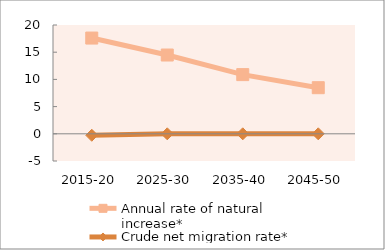
| Category | Annual rate of natural increase* | Crude net migration rate* |
|---|---|---|
| 2015-20 | 17.6 | -0.267 |
| 2025-30 | 14.48 | 0 |
| 2035-40 | 10.879 | 0 |
| 2045-50 | 8.474 | 0 |